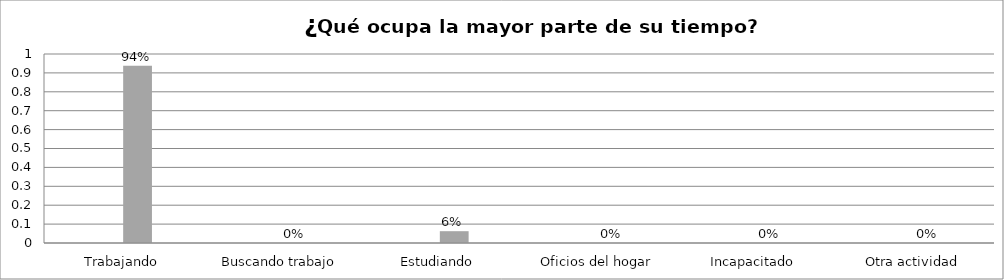
| Category | Series 0 | Series 1 | Series 2 | Series 3 |
|---|---|---|---|---|
| Trabajando |  |  | 0.938 |  |
| Buscando trabajo |  |  | 0 |  |
| Estudiando |  |  | 0.062 |  |
| Oficios del hogar |  |  | 0 |  |
| Incapacitado  |  |  | 0 |  |
| Otra actividad |  |  | 0 |  |